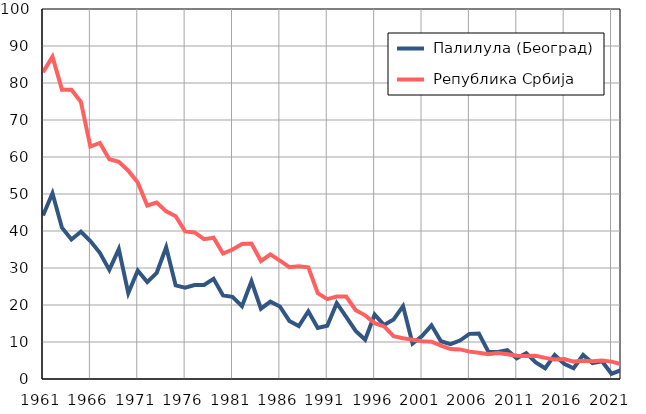
| Category |  Палилула (Београд) |  Република Србија |
|---|---|---|
| 1961.0 | 44.2 | 82.9 |
| 1962.0 | 50.2 | 87.1 |
| 1963.0 | 40.9 | 78.2 |
| 1964.0 | 37.7 | 78.2 |
| 1965.0 | 39.8 | 74.9 |
| 1966.0 | 37.3 | 62.8 |
| 1967.0 | 34.1 | 63.8 |
| 1968.0 | 29.5 | 59.4 |
| 1969.0 | 35.1 | 58.7 |
| 1970.0 | 23.2 | 56.3 |
| 1971.0 | 29.3 | 53.1 |
| 1972.0 | 26.2 | 46.9 |
| 1973.0 | 28.7 | 47.7 |
| 1974.0 | 35.6 | 45.3 |
| 1975.0 | 25.3 | 44 |
| 1976.0 | 24.7 | 39.9 |
| 1977.0 | 25.4 | 39.6 |
| 1978.0 | 25.4 | 37.8 |
| 1979.0 | 27.1 | 38.2 |
| 1980.0 | 22.6 | 33.9 |
| 1981.0 | 22.2 | 35 |
| 1982.0 | 19.7 | 36.5 |
| 1983.0 | 26.4 | 36.6 |
| 1984.0 | 19 | 31.9 |
| 1985.0 | 20.9 | 33.7 |
| 1986.0 | 19.6 | 32 |
| 1987.0 | 15.7 | 30.2 |
| 1988.0 | 14.3 | 30.5 |
| 1989.0 | 18.3 | 30.2 |
| 1990.0 | 13.8 | 23.2 |
| 1991.0 | 14.4 | 21.6 |
| 1992.0 | 20.5 | 22.3 |
| 1993.0 | 16.8 | 22.3 |
| 1994.0 | 13 | 18.6 |
| 1995.0 | 10.6 | 17.2 |
| 1996.0 | 17.4 | 15.1 |
| 1997.0 | 14.6 | 14.2 |
| 1998.0 | 16.1 | 11.6 |
| 1999.0 | 19.7 | 11 |
| 2000.0 | 9.6 | 10.6 |
| 2001.0 | 11.6 | 10.2 |
| 2002.0 | 14.5 | 10.1 |
| 2003.0 | 10.2 | 9 |
| 2004.0 | 9.4 | 8.1 |
| 2005.0 | 10.4 | 8 |
| 2006.0 | 12.2 | 7.4 |
| 2007.0 | 12.3 | 7.1 |
| 2008.0 | 7.4 | 6.7 |
| 2009.0 | 7.3 | 7 |
| 2010.0 | 7.8 | 6.7 |
| 2011.0 | 5.6 | 6.3 |
| 2012.0 | 7 | 6.2 |
| 2013.0 | 4.5 | 6.3 |
| 2014.0 | 2.9 | 5.7 |
| 2015.0 | 6.5 | 5.3 |
| 2016.0 | 4.1 | 5.4 |
| 2017.0 | 2.9 | 4.7 |
| 2018.0 | 6.5 | 4.9 |
| 2019.0 | 4.3 | 4.8 |
| 2020.0 | 4.8 | 5 |
| 2021.0 | 1.4 | 4.7 |
| 2022.0 | 2.4 | 4 |